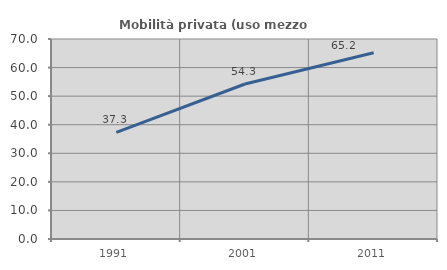
| Category | Mobilità privata (uso mezzo privato) |
|---|---|
| 1991.0 | 37.341 |
| 2001.0 | 54.257 |
| 2011.0 | 65.17 |